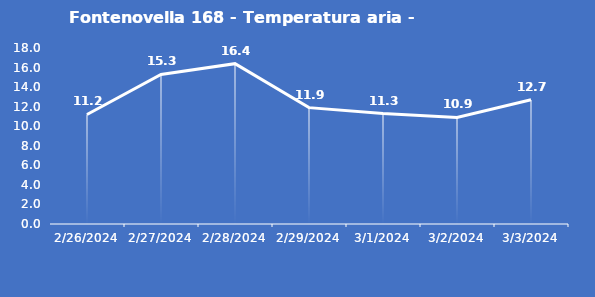
| Category | Fontenovella 168 - Temperatura aria - Grezzo (°C) |
|---|---|
| 2/26/24 | 11.2 |
| 2/27/24 | 15.3 |
| 2/28/24 | 16.4 |
| 2/29/24 | 11.9 |
| 3/1/24 | 11.3 |
| 3/2/24 | 10.9 |
| 3/3/24 | 12.7 |